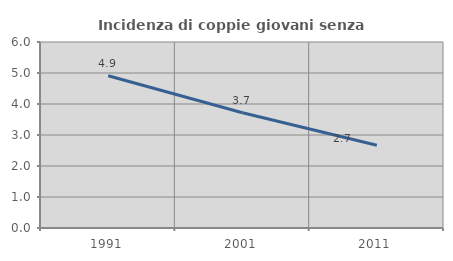
| Category | Incidenza di coppie giovani senza figli |
|---|---|
| 1991.0 | 4.912 |
| 2001.0 | 3.716 |
| 2011.0 | 2.672 |